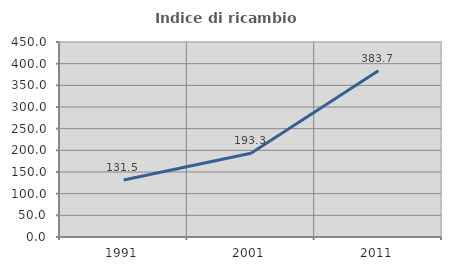
| Category | Indice di ricambio occupazionale  |
|---|---|
| 1991.0 | 131.509 |
| 2001.0 | 193.341 |
| 2011.0 | 383.74 |